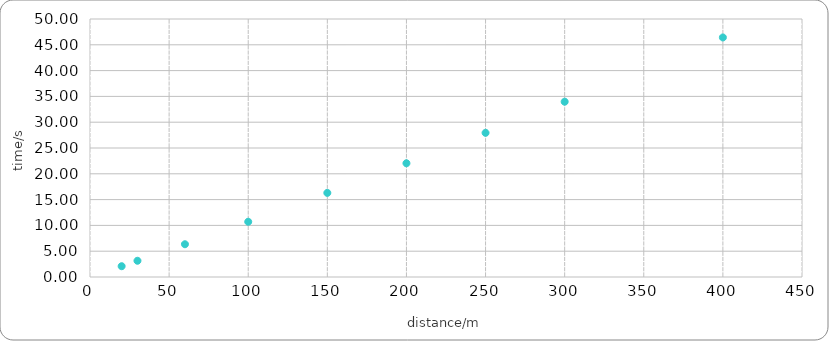
| Category | interpolated fly time/s |
|---|---|
| 20.0 | 2.09 |
| 30.0 | 3.145 |
| 60.0 | 6.348 |
| 100.0 | 10.708 |
| 150.0 | 16.3 |
| 200.0 | 22.045 |
| 250.0 | 27.937 |
| 300.0 | 33.97 |
| 400.0 | 46.423 |